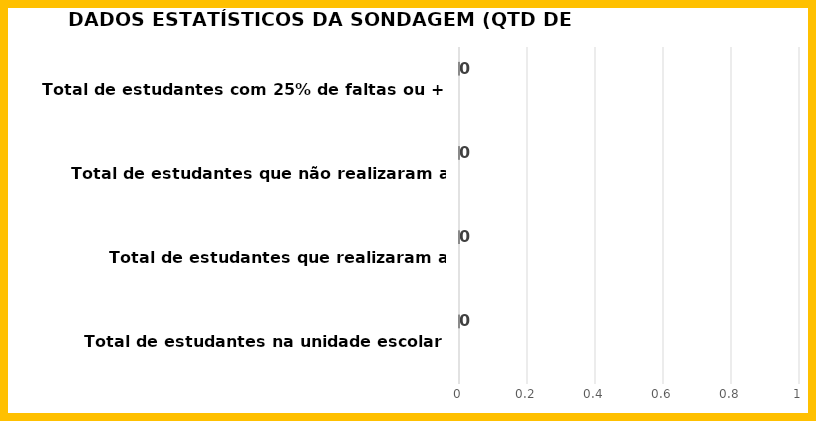
| Category | Series 0 | Series 1 | Series 2 | Series 3 |
|---|---|---|---|---|
| Total de estudantes na unidade escolar |  |  |  | 0 |
| Total de estudantes que realizaram a sondagem |  |  |  | 0 |
| Total de estudantes que não realizaram a sondagem  |  |  |  | 0 |
| Total de estudantes com 25% de faltas ou + |  |  |  | 0 |